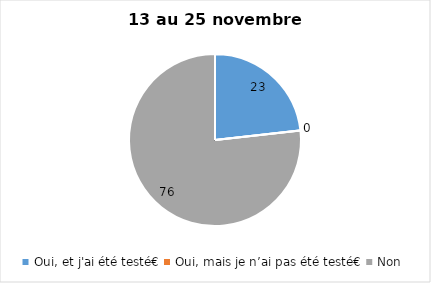
| Category | Series 0 |
|---|---|
| Oui, et j'ai été testé€ | 23 |
| Oui, mais je n’ai pas été testé€ | 0 |
| Non | 76 |